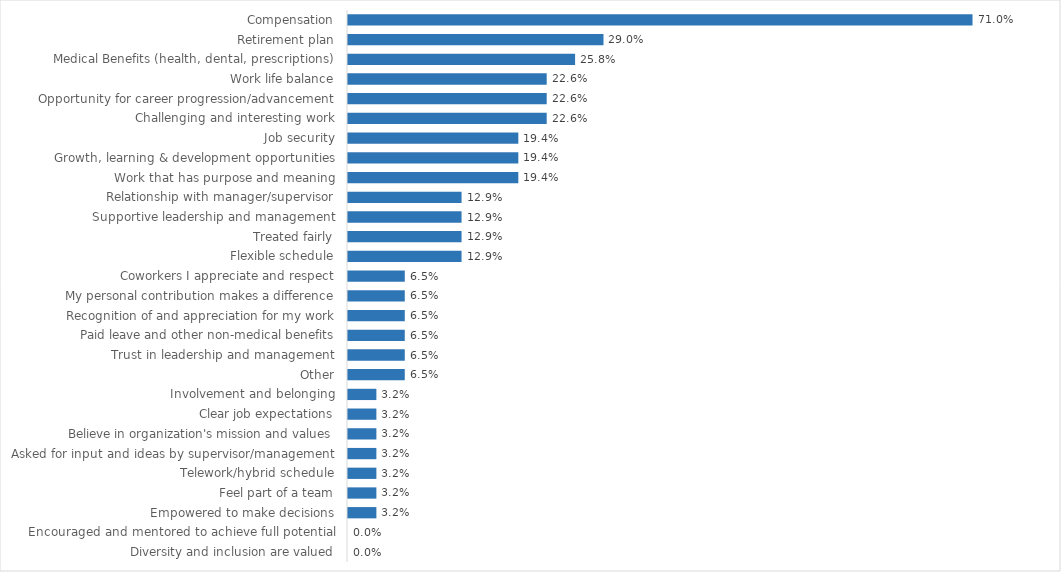
| Category | Liquor & Lottery |
|---|---|
| Compensation | 0.71 |
| Retirement plan | 0.29 |
| Medical Benefits (health, dental, prescriptions) | 0.258 |
| Work life balance | 0.226 |
| Opportunity for career progression/advancement | 0.226 |
| Challenging and interesting work | 0.226 |
| Job security | 0.194 |
| Growth, learning & development opportunities | 0.194 |
| Work that has purpose and meaning | 0.194 |
| Relationship with manager/supervisor | 0.129 |
| Supportive leadership and management | 0.129 |
| Treated fairly | 0.129 |
| Flexible schedule | 0.129 |
| Coworkers I appreciate and respect | 0.065 |
| My personal contribution makes a difference | 0.065 |
| Recognition of and appreciation for my work | 0.065 |
| Paid leave and other non-medical benefits | 0.065 |
| Trust in leadership and management | 0.065 |
| Other | 0.065 |
| Involvement and belonging | 0.032 |
| Clear job expectations | 0.032 |
| Believe in organization's mission and values | 0.032 |
| Asked for input and ideas by supervisor/management | 0.032 |
| Telework/hybrid schedule | 0.032 |
| Feel part of a team | 0.032 |
| Empowered to make decisions | 0.032 |
| Encouraged and mentored to achieve full potential | 0 |
| Diversity and inclusion are valued | 0 |